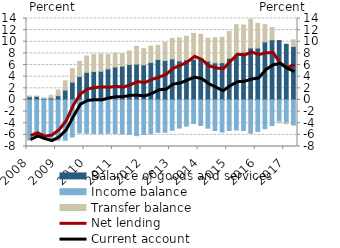
| Category | Balance of goods and services | Income balance | Transfer balance |
|---|---|---|---|
| 2008.0 | 0.545 | -6.887 | 0.144 |
| 2008.0 | 0.61 | -6.347 | 0.016 |
| 2008.0 | 0.277 | -6.657 | 0.057 |
| 2008.0 | 0.358 | -6.905 | 0.436 |
| 2009.0 | 0.728 | -6.927 | 0.987 |
| 2009.0 | 1.697 | -6.933 | 1.589 |
| 2009.0 | 3.066 | -6.363 | 2.317 |
| 2009.0 | 4.037 | -5.676 | 2.596 |
| 2010.0 | 4.746 | -5.736 | 2.798 |
| 2010.0 | 4.899 | -5.762 | 2.911 |
| 2010.0 | 4.931 | -5.782 | 2.992 |
| 2010.0 | 5.35 | -5.725 | 2.481 |
| 2011.0 | 5.661 | -5.779 | 2.365 |
| 2011.0 | 5.81 | -5.851 | 2.156 |
| 2011.0 | 6.104 | -5.902 | 2.32 |
| 2011.0 | 6.163 | -6.14 | 3.059 |
| 2012.0 | 6.044 | -5.934 | 2.777 |
| 2012.0 | 6.452 | -5.814 | 2.795 |
| 2012.0 | 6.968 | -5.561 | 2.427 |
| 2012.0 | 6.782 | -5.556 | 3.082 |
| 2013.0 | 7.049 | -5.208 | 3.526 |
| 2013.0 | 6.711 | -4.831 | 3.971 |
| 2013.0 | 6.903 | -4.499 | 4.057 |
| 2013.0 | 6.992 | -4.037 | 4.457 |
| 2014.0 | 7.069 | -4.392 | 4.211 |
| 2014.0 | 6.684 | -4.841 | 3.935 |
| 2014.0 | 6.384 | -5.253 | 4.295 |
| 2014.0 | 6.414 | -5.509 | 4.354 |
| 2015.0 | 7.172 | -5.243 | 4.586 |
| 2015.0 | 7.857 | -5.167 | 5.084 |
| 2015.0 | 8.224 | -5.252 | 4.664 |
| 2015.0 | 8.941 | -5.711 | 4.927 |
| 2016.0 | 8.922 | -5.422 | 4.226 |
| 2016.0 | 9.974 | -4.931 | 2.975 |
| 2016.0 | 10.343 | -4.395 | 2.111 |
| 2016.0 | 10.206 | -3.672 | -0.261 |
| 2017.0 | 9.569 | -3.913 | -0.195 |
| 2017.0 | 9.184 | -4.303 | 1.148 |